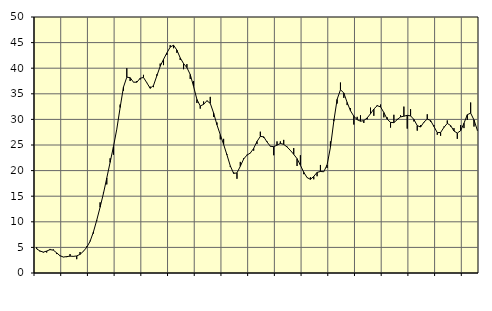
| Category | Piggar | Series 1 |
|---|---|---|
| nan | 5 | 4.7 |
| 87.0 | 4.2 | 4.3 |
| 87.0 | 4 | 4.08 |
| 87.0 | 4 | 4.28 |
| nan | 4.7 | 4.57 |
| 88.0 | 4.6 | 4.46 |
| 88.0 | 3.7 | 3.93 |
| 88.0 | 3.3 | 3.37 |
| nan | 3.1 | 3.12 |
| 89.0 | 3.1 | 3.2 |
| 89.0 | 3.7 | 3.29 |
| 89.0 | 3.2 | 3.25 |
| nan | 2.7 | 3.33 |
| 90.0 | 4.1 | 3.64 |
| 90.0 | 4.3 | 4.24 |
| 90.0 | 5.2 | 5.01 |
| nan | 6.3 | 6.19 |
| 91.0 | 7.7 | 8.01 |
| 91.0 | 10.2 | 10.33 |
| 91.0 | 13.8 | 12.85 |
| nan | 15.7 | 15.53 |
| 92.0 | 17.3 | 18.55 |
| 92.0 | 22.4 | 21.61 |
| 92.0 | 23.1 | 24.68 |
| nan | 28.1 | 28.09 |
| 93.0 | 32.9 | 32.32 |
| 93.0 | 35.6 | 36.3 |
| 93.0 | 40 | 38.25 |
| nan | 37.5 | 38.15 |
| 94.0 | 37.3 | 37.27 |
| 94.0 | 37.5 | 37.26 |
| 94.0 | 37.8 | 38.04 |
| nan | 38.7 | 38.19 |
| 95.0 | 37.1 | 37.15 |
| 95.0 | 36.4 | 36.08 |
| 95.0 | 36.3 | 36.63 |
| nan | 38.8 | 38.52 |
| 96.0 | 40.9 | 40.38 |
| 96.0 | 40.6 | 41.73 |
| 96.0 | 42.6 | 42.98 |
| nan | 44.5 | 44.12 |
| 97.0 | 43.9 | 44.49 |
| 97.0 | 43 | 43.54 |
| 97.0 | 41.6 | 42.02 |
| nan | 39.8 | 40.91 |
| 98.0 | 40.8 | 40.12 |
| 98.0 | 37.9 | 38.77 |
| 98.0 | 37.5 | 36.44 |
| nan | 33.2 | 33.9 |
| 99.0 | 32.1 | 32.62 |
| 99.0 | 33.5 | 32.94 |
| 99.0 | 33.7 | 33.64 |
| nan | 34.4 | 33.14 |
| 0.0 | 30.5 | 31.25 |
| 0.0 | 29.4 | 28.95 |
| 0.0 | 26.1 | 27.02 |
| nan | 26.2 | 25.12 |
| 1.0 | 23.2 | 23.06 |
| 1.0 | 20.7 | 20.93 |
| 1.0 | 19.7 | 19.45 |
| nan | 18.4 | 19.55 |
| 2.0 | 21.7 | 20.84 |
| 2.0 | 22.4 | 22.27 |
| 2.0 | 23.1 | 23.03 |
| nan | 23.4 | 23.43 |
| 3.0 | 23.9 | 24.34 |
| 3.0 | 25.2 | 25.69 |
| 3.0 | 27.6 | 26.68 |
| nan | 26.4 | 26.6 |
| 4.0 | 25.7 | 25.59 |
| 4.0 | 24.7 | 24.76 |
| 4.0 | 23 | 24.67 |
| nan | 25.7 | 24.97 |
| 5.0 | 25.7 | 25.3 |
| 5.0 | 26 | 25.12 |
| 5.0 | 24.7 | 24.62 |
| nan | 24 | 23.95 |
| 6.0 | 24.4 | 23.18 |
| 6.0 | 20.9 | 22.33 |
| 6.0 | 23 | 21.04 |
| nan | 19.3 | 19.68 |
| 7.0 | 18.6 | 18.64 |
| 7.0 | 18.7 | 18.29 |
| 7.0 | 18.3 | 18.86 |
| nan | 18.9 | 19.65 |
| 8.0 | 21.1 | 19.83 |
| 8.0 | 19.8 | 19.78 |
| 8.0 | 20.5 | 21.11 |
| nan | 25.7 | 24.56 |
| 9.0 | 30 | 29.63 |
| 9.0 | 33.1 | 33.91 |
| 9.0 | 37.2 | 35.79 |
| nan | 34.2 | 35.17 |
| 10.0 | 32.8 | 33.31 |
| 10.0 | 32.2 | 31.69 |
| 10.0 | 29 | 30.63 |
| nan | 30.5 | 29.94 |
| 11.0 | 30.8 | 29.65 |
| 11.0 | 29.3 | 29.76 |
| 11.0 | 30 | 30.29 |
| nan | 32.3 | 31.1 |
| 12.0 | 30.7 | 32.03 |
| 12.0 | 32.8 | 32.67 |
| 12.0 | 32.9 | 32.46 |
| nan | 30.4 | 31.34 |
| 13.0 | 30.4 | 30.04 |
| 13.0 | 28.4 | 29.42 |
| 13.0 | 30.9 | 29.37 |
| nan | 30.1 | 29.95 |
| 14.0 | 30.8 | 30.49 |
| 14.0 | 32.5 | 30.62 |
| 14.0 | 28.2 | 30.8 |
| nan | 32 | 30.69 |
| 15.0 | 29.6 | 29.99 |
| 15.0 | 27.8 | 28.79 |
| 15.0 | 28.9 | 28.51 |
| nan | 29.4 | 29.46 |
| 16.0 | 31 | 30.07 |
| 16.0 | 29.5 | 29.77 |
| 16.0 | 28.9 | 28.61 |
| nan | 27 | 27.42 |
| 17.0 | 26.8 | 27.44 |
| 17.0 | 28.6 | 28.44 |
| 17.0 | 29.8 | 29.22 |
| nan | 28.6 | 28.8 |
| 18.0 | 28.3 | 27.73 |
| 18.0 | 26.2 | 27.33 |
| 18.0 | 28.9 | 27.79 |
| nan | 28.3 | 29.25 |
| 19.0 | 29.9 | 30.92 |
| 19.0 | 33.3 | 31.23 |
| 19.0 | 28.6 | 29.89 |
| nan | 27.8 | 27.89 |